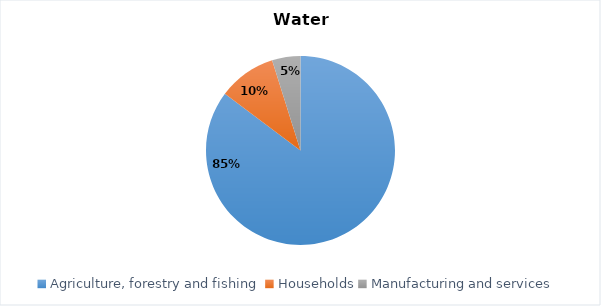
| Category | Series 0 |
|---|---|
| Agriculture, forestry and fishing | 475.503 |
| Households | 55.258 |
| Manufacturing and services | 27.103 |